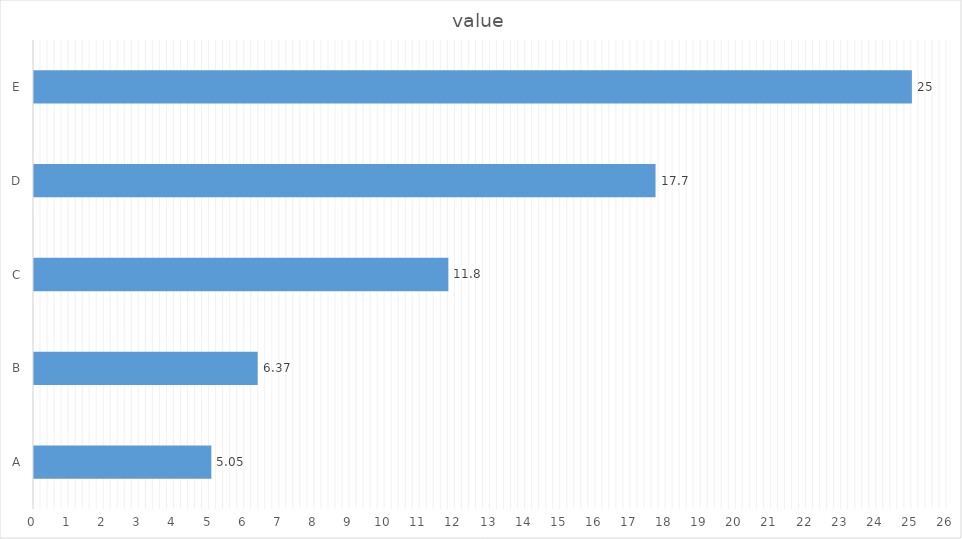
| Category | value |
|---|---|
| A | 5.05 |
| B | 6.37 |
| C | 11.8 |
| D | 17.7 |
| E | 25 |